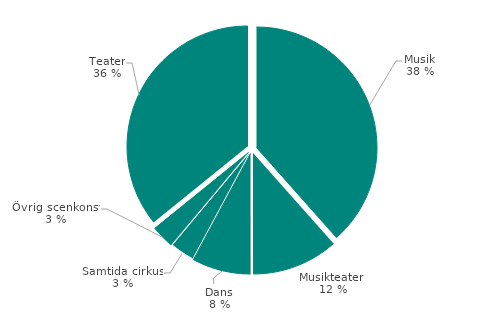
| Category | Antal  | Andel (%) |
|---|---|---|
| Musik | 1982329 | 38.443 |
| Musikteater  | 595470 | 11.548 |
| Dans | 405280 | 7.859 |
| Samtida cirkus | 166749 | 3.234 |
| Övrig scenkonst | 159234 | 3.088 |
| Teater | 1847523 | 35.828 |